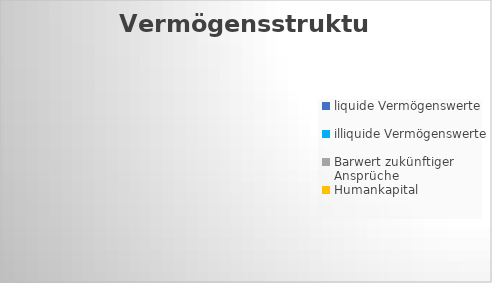
| Category | Series 0 |
|---|---|
| liquide Vermögenswerte | 0 |
| illiquide Vermögenswerte | 0 |
| Barwert zukünftiger Ansprüche | 0 |
| Humankapital | 0 |